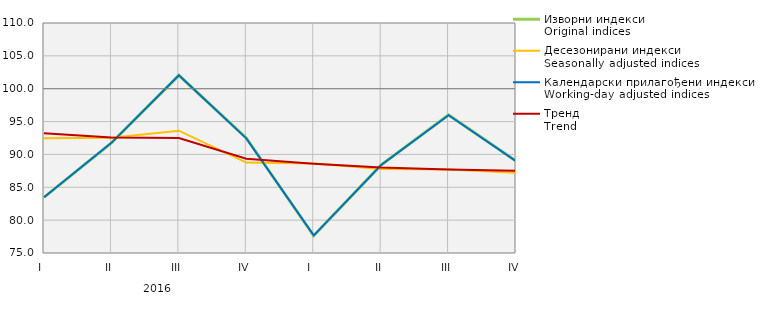
| Category | Изворни индекси
Original indices | Десезонирани индекси
Seasonally adjusted indices | Календарски прилагођени индекси
Working-day adjusted indices | Тренд
Trend |
|---|---|---|---|---|
| I  | 83.476 | 92.459 | 83.476 | 93.229 |
| II | 91.763 | 92.521 | 91.763 | 92.582 |
| III | 102.022 | 93.618 | 102.052 | 92.508 |
| IV | 92.509 | 88.759 | 92.449 | 89.353 |
| I  | 77.626 | 88.636 | 77.686 | 88.581 |
| II | 88.392 | 87.798 | 88.392 | 88 |
| III | 96.04 | 87.691 | 95.981 | 87.71 |
| IV | 89.014 | 87.207 | 88.964 | 87.497 |